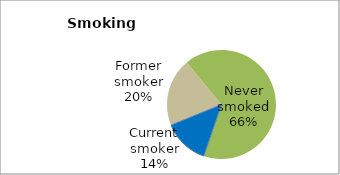
| Category | Series 0 |
|---|---|
| Current smoker | 13.545 |
| Former smoker | 20.188 |
| Never smoked | 66.267 |